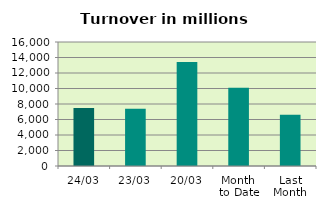
| Category | Series 0 |
|---|---|
| 24/03 | 7479.337 |
| 23/03 | 7379.398 |
| 20/03 | 13404.349 |
| Month 
to Date | 10112.828 |
| Last
Month | 6605.047 |